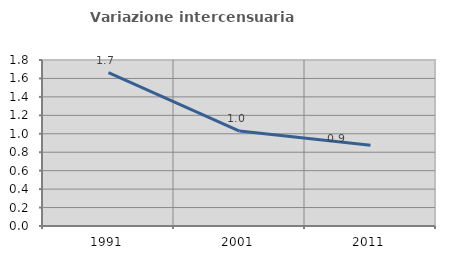
| Category | Variazione intercensuaria annua |
|---|---|
| 1991.0 | 1.663 |
| 2001.0 | 1.029 |
| 2011.0 | 0.875 |